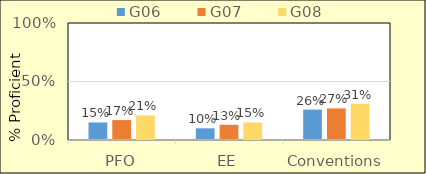
| Category | G06 | G07 | G08 |
|---|---|---|---|
| PFO | 15 | 17 | 21 |
| EE | 10 | 13 | 15 |
| Conventions | 26 | 27 | 31 |